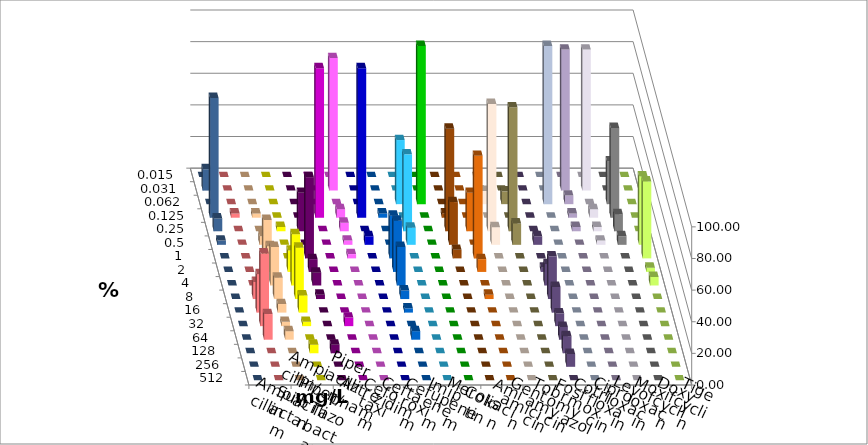
| Category | Ampicillin | Ampicillin/ Sulbactam | Piperacillin | Piperacillin/ Tazobactam | Aztreonam | Cefotaxim | Ceftazidim | Cefuroxim | Imipenem | Meropenem | Colistin | Amikacin | Gentamicin | Tobramycin | Fosfomycin | Cotrimoxazol | Ciprofloxacin | Levofloxacin | Moxifloxacin | Doxycyclin | Tigecyclin |
|---|---|---|---|---|---|---|---|---|---|---|---|---|---|---|---|---|---|---|---|---|---|
| 0.015 | 0 | 0 | 0 | 0 | 0 | 0 | 0 | 0 | 0 | 0 | 0 | 0 | 0 | 0 | 0 | 0 | 0 | 0 | 0 | 0 | 0 |
| 0.031 | 0 | 0 | 0 | 0 | 0 | 83.784 | 0 | 0 | 0 | 0 | 0 | 0 | 0 | 0 | 0 | 0 | 89.189 | 89.189 | 0 | 0 | 13.514 |
| 0.062 | 0 | 0 | 0 | 0 | 0 | 0 | 0 | 0 | 40.541 | 100 | 0 | 0 | 8.333 | 8.108 | 0 | 100 | 5.405 | 0 | 27.027 | 0 | 0 |
| 0.125 | 2.703 | 2.703 | 0 | 0 | 94.595 | 5.405 | 94.595 | 2.703 | 0 | 0 | 2.703 | 0 | 0 | 0 | 0 | 0 | 2.703 | 5.405 | 56.757 | 0 | 75.676 |
| 0.25 | 0 | 0 | 2.703 | 24.324 | 0 | 5.405 | 0 | 0 | 48.649 | 0 | 64.865 | 24.324 | 80.556 | 78.378 | 0 | 0 | 2.703 | 2.703 | 10.811 | 0 | 8.108 |
| 0.5 | 0 | 5.405 | 0 | 0 | 0 | 2.703 | 5.405 | 0 | 10.811 | 0 | 27.027 | 0 | 11.111 | 13.514 | 5.405 | 0 | 0 | 2.703 | 5.405 | 43.243 | 2.703 |
| 1.0 | 0 | 24.324 | 0 | 51.351 | 0 | 2.703 | 0 | 27.027 | 0 | 0 | 5.405 | 64.865 | 0 | 0 | 0 | 0 | 0 | 0 | 0 | 48.649 | 0 |
| 2.0 | 0 | 16.216 | 13.514 | 8.108 | 0 | 0 | 0 | 32.432 | 0 | 0 | 0 | 8.108 | 0 | 0 | 2.703 | 0 | 0 | 0 | 0 | 2.703 | 0 |
| 4.0 | 0 | 24.324 | 32.432 | 8.108 | 0 | 0 | 0 | 24.324 | 0 | 0 | 0 | 0 | 0 | 0 | 13.514 | 0 | 0 | 0 | 0 | 5.405 | 0 |
| 8.0 | 10.811 | 13.514 | 32.432 | 2.703 | 0 | 0 | 0 | 5.405 | 0 | 0 | 0 | 2.703 | 0 | 0 | 27.027 | 0 | 0 | 0 | 0 | 0 | 0 |
| 16.0 | 24.324 | 5.405 | 10.811 | 0 | 0 | 0 | 0 | 2.703 | 0 | 0 | 0 | 0 | 0 | 0 | 16.216 | 0 | 0 | 0 | 0 | 0 | 0 |
| 32.0 | 45.946 | 2.703 | 2.703 | 0 | 5.405 | 0 | 0 | 0 | 0 | 0 | 0 | 0 | 0 | 0 | 8.108 | 0 | 0 | 0 | 0 | 0 | 0 |
| 64.0 | 16.216 | 5.405 | 0 | 0 | 0 | 0 | 0 | 5.405 | 0 | 0 | 0 | 0 | 0 | 0 | 8.108 | 0 | 0 | 0 | 0 | 0 | 0 |
| 128.0 | 0 | 0 | 5.405 | 5.405 | 0 | 0 | 0 | 0 | 0 | 0 | 0 | 0 | 0 | 0 | 10.811 | 0 | 0 | 0 | 0 | 0 | 0 |
| 256.0 | 0 | 0 | 0 | 0 | 0 | 0 | 0 | 0 | 0 | 0 | 0 | 0 | 0 | 0 | 8.108 | 0 | 0 | 0 | 0 | 0 | 0 |
| 512.0 | 0 | 0 | 0 | 0 | 0 | 0 | 0 | 0 | 0 | 0 | 0 | 0 | 0 | 0 | 0 | 0 | 0 | 0 | 0 | 0 | 0 |